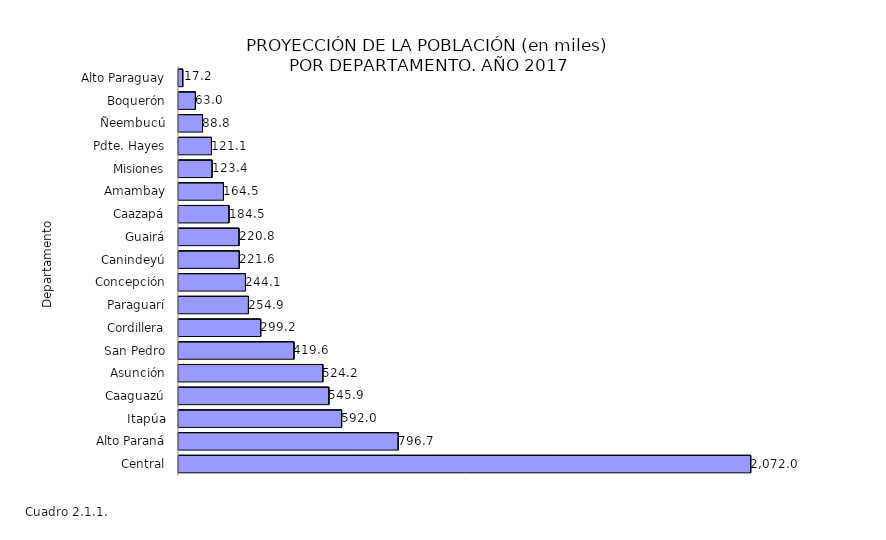
| Category | Series 0 |
|---|---|
| Central | 2072.041 |
| Alto Paraná | 796.689 |
| Itapúa | 592.017 |
| Caaguazú | 545.904 |
| Asunción | 524.19 |
| San Pedro | 419.629 |
| Cordillera | 299.234 |
| Paraguarí | 254.884 |
| Concepción | 244.071 |
| Canindeyú | 221.647 |
| Guairá | 220.818 |
| Caazapá | 184.53 |
| Amambay | 164.462 |
| Misiones | 123.442 |
| Pdte. Hayes | 121.075 |
| Ñeembucú | 88.784 |
| Boquerón | 63.011 |
| Alto Paraguay | 17.219 |